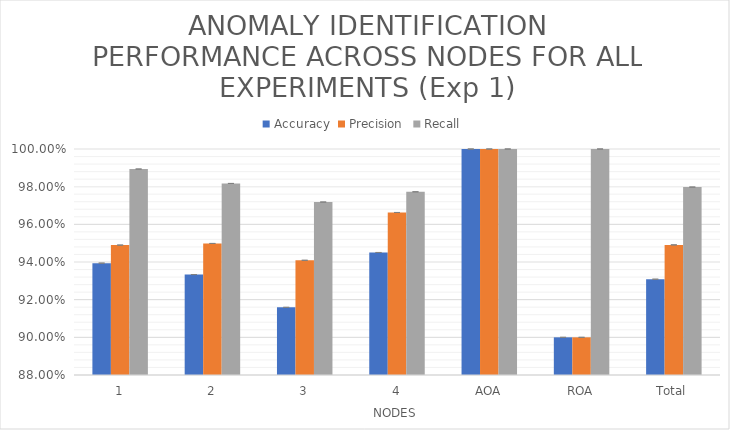
| Category | Accuracy | Precision | Recall |
|---|---|---|---|
| 1 | 0.939 | 0.949 | 0.989 |
| 2 | 0.933 | 0.95 | 0.982 |
| 3 | 0.916 | 0.941 | 0.972 |
| 4 | 0.945 | 0.966 | 0.977 |
| AOA | 1 | 1 | 1 |
| ROA | 0.9 | 0.9 | 1 |
| Total | 0.931 | 0.949 | 0.98 |